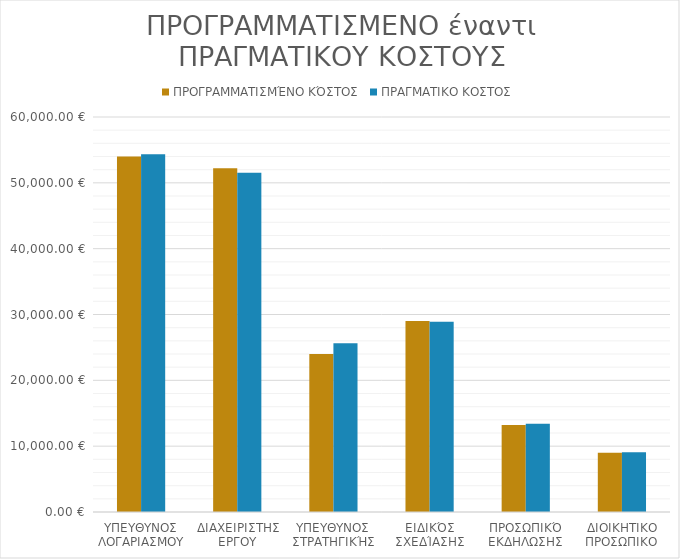
| Category | ΠΡΟΓΡΑΜΜΑΤΙΣΜΈΝΟ ΚΌΣΤΟΣ | ΠΡΑΓΜΑΤΙΚΟ ΚΟΣΤΟΣ |
|---|---|---|
| ΥΠΕΥΘΥΝΟΣ ΛΟΓΑΡΙΑΣΜΟΥ | 54000 | 54360 |
| ΔΙΑΧΕΙΡΙΣΤΗΣ ΕΡΓΟΥ | 52200 | 51540 |
| ΥΠΕΥΘΥΝΟΣ ΣΤΡΑΤΗΓΙΚΉΣ | 24000 | 25650 |
| ΕΙΔΙΚΌΣ ΣΧΕΔΊΑΣΗΣ | 29000 | 28900 |
| ΠΡΟΣΩΠΙΚΌ ΕΚΔΗΛΩΣΗΣ | 13200 | 13400 |
| ΔΙΟΙΚΗΤΙΚΟ ΠΡΟΣΩΠΙΚΟ | 9000 | 9060 |